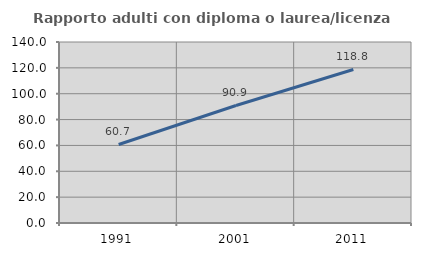
| Category | Rapporto adulti con diploma o laurea/licenza media  |
|---|---|
| 1991.0 | 60.741 |
| 2001.0 | 90.889 |
| 2011.0 | 118.764 |